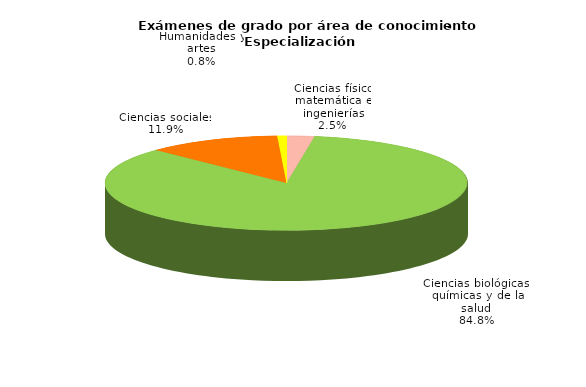
| Category | Series 0 |
|---|---|
| Ciencias físico matemática e ingenierías | 139 |
| Ciencias biológicas, químicas y de la salud | 4777 |
| Ciencias sociales | 668 |
| Humanidades y artes | 46 |